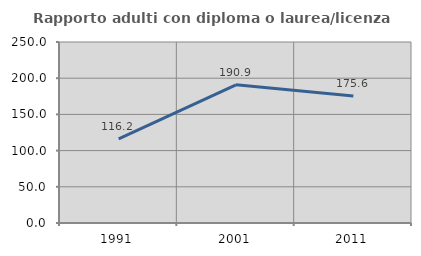
| Category | Rapporto adulti con diploma o laurea/licenza media  |
|---|---|
| 1991.0 | 116.216 |
| 2001.0 | 190.909 |
| 2011.0 | 175.556 |